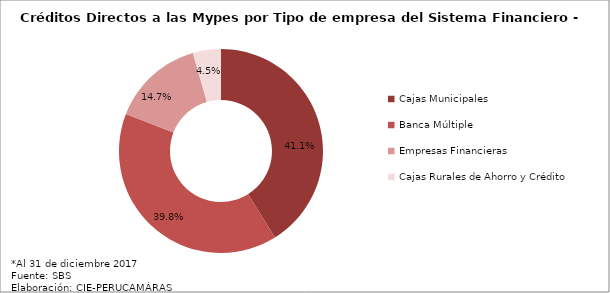
| Category | Series 0 |
|---|---|
| Cajas Municipales | 2436.987 |
| Banca Múltiple | 2356.337 |
| Empresas Financieras | 868.505 |
| Cajas Rurales de Ahorro y Crédito | 263.931 |